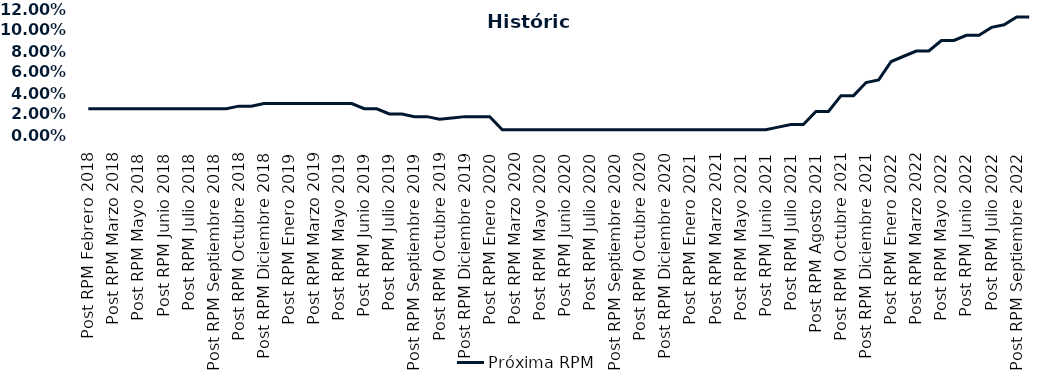
| Category | Próxima RPM |
|---|---|
| Post RPM Febrero 2018 | 0.025 |
| Pre RPM Marzo 2018 | 0.025 |
| Post RPM Marzo 2018 | 0.025 |
| Pre RPM Mayo 2018 | 0.025 |
| Post RPM Mayo 2018 | 0.025 |
| Pre RPM Junio 2018 | 0.025 |
| Post RPM Junio 2018 | 0.025 |
| Pre RPM Julio 2018 | 0.025 |
| Post RPM Julio 2018 | 0.025 |
| Pre RPM Septiembre 2018 | 0.025 |
| Post RPM Septiembre 2018 | 0.025 |
| Pre RPM Octubre 2018 | 0.025 |
| Post RPM Octubre 2018 | 0.028 |
| Pre RPM Diciembre 2018 | 0.028 |
| Post RPM Diciembre 2018 | 0.03 |
| Pre RPM Enero 2019 | 0.03 |
| Post RPM Enero 2019 | 0.03 |
| Pre RPM Marzo 2019 | 0.03 |
| Post RPM Marzo 2019 | 0.03 |
| Pre RPM Mayo 2019 | 0.03 |
| Post RPM Mayo 2019 | 0.03 |
| Pre RPM Junio 2019 | 0.03 |
| Post RPM Junio 2019 | 0.025 |
| Pre RPM Julio 2019 | 0.025 |
| Post RPM Julio 2019 | 0.02 |
| Pre RPM Septiembre 2019 | 0.02 |
| Post RPM Septiembre 2019 | 0.018 |
| Pre RPM Octubre 2019 | 0.018 |
| Post RPM Octubre 2019 | 0.015 |
| Pre RPM Diciembre 2019 | 0.016 |
| Post RPM Diciembre 2019 | 0.018 |
| Pre RPM Enero 2020 | 0.018 |
| Post RPM Enero 2020 | 0.018 |
| Pre RPM Marzo 2020 | 0.005 |
| Post RPM Marzo 2020 | 0.005 |
| Pre RPM Mayo 2020 | 0.005 |
| Post RPM Mayo 2020 | 0.005 |
| Pre RPM Junio 2020 | 0.005 |
| Post RPM Junio 2020 | 0.005 |
| Pre RPM Julio 2020 | 0.005 |
| Post RPM Julio 2020 | 0.005 |
| Pre RPM Septiembre 2020 | 0.005 |
| Post RPM Septiembre 2020 | 0.005 |
| Pre RPM Octubre 2020 | 0.005 |
| Post RPM Octubre 2020 | 0.005 |
| Pre RPM Diciembre 2020 | 0.005 |
| Post RPM Diciembre 2020 | 0.005 |
| Pre RPM Enero 2021 | 0.005 |
| Post RPM Enero 2021 | 0.005 |
| Pre RPM Marzo 2021 | 0.005 |
| Post RPM Marzo 2021 | 0.005 |
| Pre RPM Mayo 2021 | 0.005 |
| Post RPM Mayo 2021 | 0.005 |
| Pre RPM Junio 2021 | 0.005 |
| Post RPM Junio 2021 | 0.005 |
| Pre RPM Julio 2021 | 0.008 |
| Post RPM Julio 2021 | 0.01 |
| Pre RPM Agosto 2021 | 0.01 |
| Post RPM Agosto 2021 | 0.022 |
| Pre RPM Octubre 2021 | 0.022 |
| Post RPM Octubre 2021 | 0.038 |
| Pre RPM Diciembre 2021 | 0.038 |
| Post RPM Diciembre 2021 | 0.05 |
| Pre RPM Enero 2022 | 0.052 |
| Post RPM Enero 2022 | 0.07 |
| Pre RPM Marzo 2022 | 0.075 |
| Post RPM Marzo 2022 | 0.08 |
| Pre RPM Mayo 2022 | 0.08 |
| Post RPM Mayo 2022 | 0.09 |
| Pre RPM Junio 2022 | 0.09 |
| Post RPM Junio 2022 | 0.095 |
| Pre RPM Julio 2022 | 0.095 |
| Post RPM Julio 2022 | 0.102 |
| Pre RPM Septiembre 2022 | 0.105 |
| Post RPM Septiembre 2022 | 0.112 |
| Pre RPM Octubre 2022 | 0.112 |